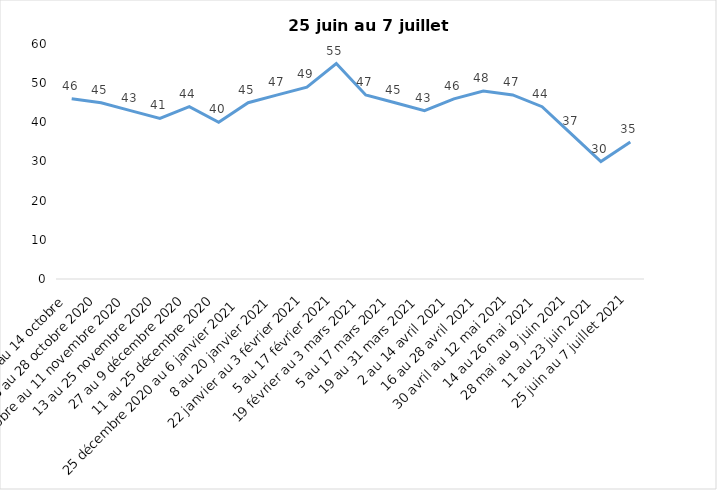
| Category | Toujours aux trois mesures |
|---|---|
| 2 au 14 octobre  | 46 |
| 16 au 28 octobre 2020 | 45 |
| 30 octobre au 11 novembre 2020 | 43 |
| 13 au 25 novembre 2020 | 41 |
| 27 au 9 décembre 2020 | 44 |
| 11 au 25 décembre 2020 | 40 |
| 25 décembre 2020 au 6 janvier 2021 | 45 |
| 8 au 20 janvier 2021 | 47 |
| 22 janvier au 3 février 2021 | 49 |
| 5 au 17 février 2021 | 55 |
| 19 février au 3 mars 2021 | 47 |
| 5 au 17 mars 2021 | 45 |
| 19 au 31 mars 2021 | 43 |
| 2 au 14 avril 2021 | 46 |
| 16 au 28 avril 2021 | 48 |
| 30 avril au 12 mai 2021 | 47 |
| 14 au 26 mai 2021 | 44 |
| 28 mai au 9 juin 2021 | 37 |
| 11 au 23 juin 2021 | 30 |
| 25 juin au 7 juillet 2021 | 35 |